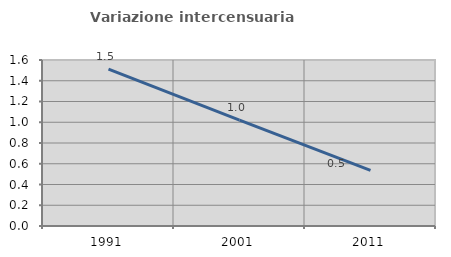
| Category | Variazione intercensuaria annua |
|---|---|
| 1991.0 | 1.512 |
| 2001.0 | 1.021 |
| 2011.0 | 0.536 |